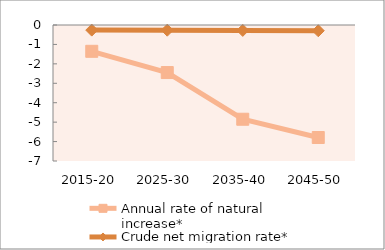
| Category | Annual rate of natural increase* | Crude net migration rate* |
|---|---|---|
| 2015-20 | -1.354 | -0.263 |
| 2025-30 | -2.448 | -0.268 |
| 2035-40 | -4.851 | -0.279 |
| 2045-50 | -5.791 | -0.296 |